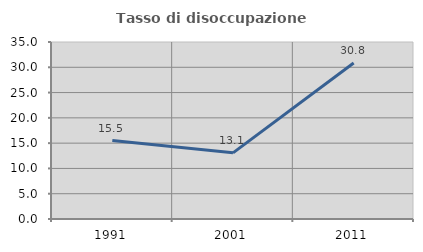
| Category | Tasso di disoccupazione giovanile  |
|---|---|
| 1991.0 | 15.508 |
| 2001.0 | 13.084 |
| 2011.0 | 30.841 |